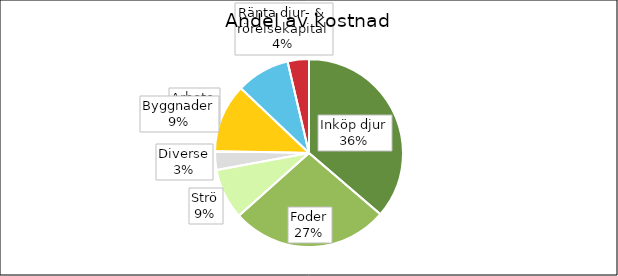
| Category | Värde, kr | Kr/dag |
|---|---|---|
| Inköp djur | 7975 | 15.432 |
| Foder | 5957.16 | 11.527 |
| Strö | 1915.2 | 3.706 |
| Diverse | 710 | 1.374 |
| Arbete | 2584 | 5 |
| Byggnader | 2033.333 | 3.934 |
| Ränta djur- & rörelsekapital | 806.168 | 1.56 |